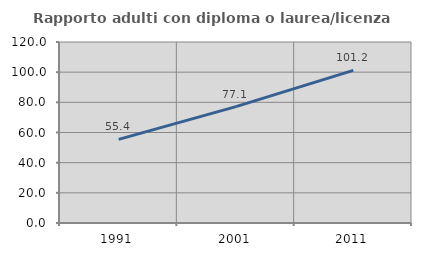
| Category | Rapporto adulti con diploma o laurea/licenza media  |
|---|---|
| 1991.0 | 55.412 |
| 2001.0 | 77.134 |
| 2011.0 | 101.191 |